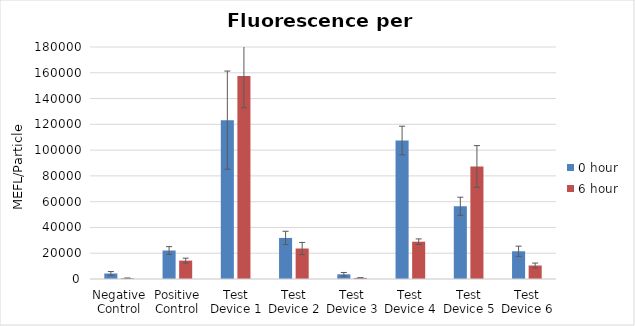
| Category | 0 hour | 6 hour |
|---|---|---|
| Negative Control | 4269.304 | 613.761 |
| Positive Control | 22098.265 | 14272.99 |
| Test Device 1 | 123247.236 | 157490.942 |
| Test Device 2 | 31855.99 | 23666.181 |
| Test Device 3 | 3638.516 | 844.996 |
| Test Device 4 | 107433.167 | 28926.037 |
| Test Device 5 | 56444.71 | 87354.366 |
| Test Device 6 | 21516.713 | 10469.063 |